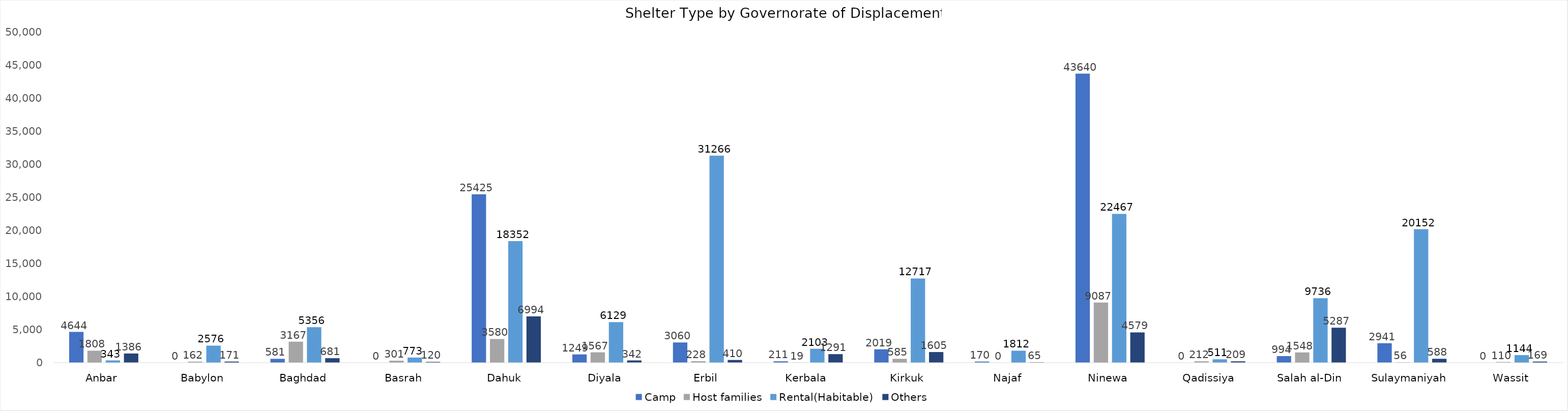
| Category | Camp | Host families | Rental(Habitable) | Others |
|---|---|---|---|---|
| Anbar | 4644 | 1808 | 343 | 1386 |
| Babylon | 0 | 162 | 2576 | 171 |
| Baghdad | 581 | 3167 | 5356 | 681 |
| Basrah | 0 | 301 | 773 | 120 |
| Dahuk | 25425 | 3580 | 18352 | 6994 |
| Diyala | 1249 | 1567 | 6129 | 342 |
| Erbil | 3060 | 228 | 31266 | 410 |
| Kerbala | 211 | 19 | 2103 | 1291 |
| Kirkuk | 2019 | 585 | 12717 | 1605 |
| Najaf | 170 | 0 | 1812 | 65 |
| Ninewa | 43640 | 9087 | 22467 | 4579 |
| Qadissiya | 0 | 212 | 511 | 209 |
| Salah al-Din | 994 | 1548 | 9736 | 5287 |
| Sulaymaniyah | 2941 | 56 | 20152 | 588 |
| Wassit | 0 | 110 | 1144 | 169 |